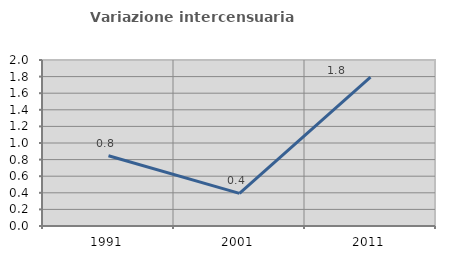
| Category | Variazione intercensuaria annua |
|---|---|
| 1991.0 | 0.846 |
| 2001.0 | 0.394 |
| 2011.0 | 1.794 |